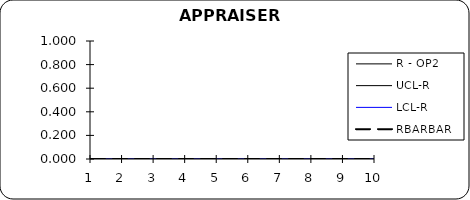
| Category | R - OP2 | UCL-R | LCL-R | RBARBAR |
|---|---|---|---|---|
| 0 | 0 | 0 | 0 | 0 |
| 1 | 0 | 0 | 0 | 0 |
| 2 | 0 | 0 | 0 | 0 |
| 3 | 0 | 0 | 0 | 0 |
| 4 | 0 | 0 | 0 | 0 |
| 5 | 0 | 0 | 0 | 0 |
| 6 | 0 | 0 | 0 | 0 |
| 7 | 0 | 0 | 0 | 0 |
| 8 | 0 | 0 | 0 | 0 |
| 9 | 0 | 0 | 0 | 0 |